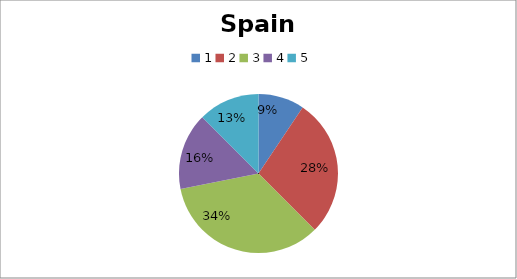
| Category | Spain |
|---|---|
| 0 | 3 |
| 1 | 9 |
| 2 | 11 |
| 3 | 5 |
| 4 | 4 |